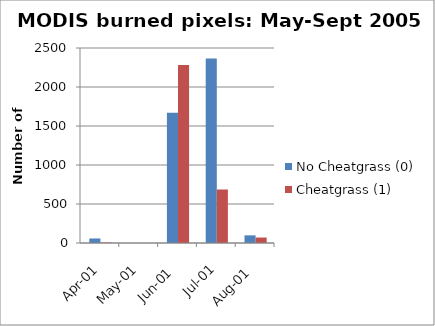
| Category | No Cheatgrass (0) | Cheatgrass (1) |
|---|---|---|
| 2001-04-30 | 58 | 6 |
| 2001-05-31 | 0 | 0 |
| 2001-06-30 | 1671 | 2282 |
| 2001-07-31 | 2366 | 686 |
| 2001-08-31 | 98 | 70 |